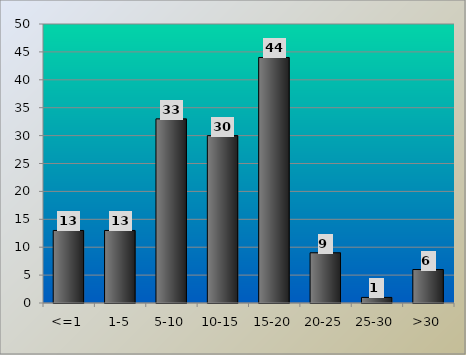
| Category | Series 0 |
|---|---|
| <=1 | 13 |
| 1-5 | 13 |
| 5-10 | 33 |
| 10-15 | 30 |
| 15-20 | 44 |
| 20-25 | 9 |
| 25-30 | 1 |
| >30 | 6 |